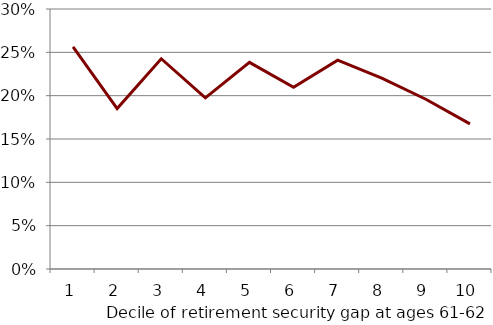
| Category | Share with any nontraditional work after age 62 |
|---|---|
| 0 | 0.256 |
| 1 | 0.185 |
| 2 | 0.243 |
| 3 | 0.198 |
| 4 | 0.238 |
| 5 | 0.21 |
| 6 | 0.241 |
| 7 | 0.22 |
| 8 | 0.196 |
| 9 | 0.167 |